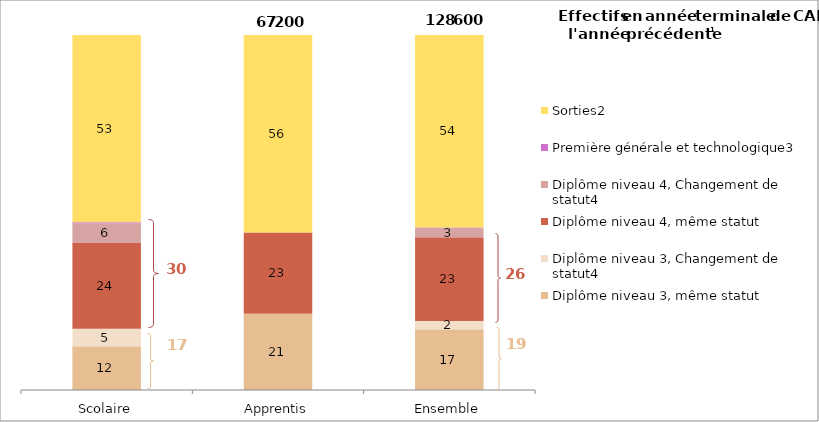
| Category | Diplôme niveau 3, même statut | Diplôme niveau 3, Changement de statut4 | Diplôme niveau 4, même statut | Diplôme niveau 4, Changement de statut4 | Première générale et technologique3 | Sorties2 |
|---|---|---|---|---|---|---|
| Scolaire | 12.248 | 5.029 | 24.106 | 5.621 | 0.228 | 52.768 |
| Apprentis | 21.403 | 0.054 | 22.922 | 0.016 | 0.001 | 55.603 |
| Ensemble | 17.034 | 2.428 | 23.487 | 2.691 | 0.11 | 54.25 |